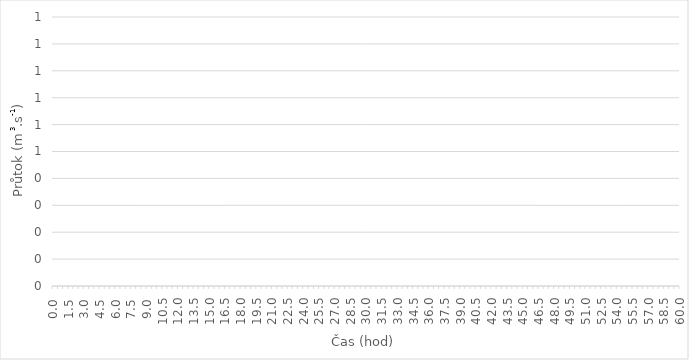
| Category | - |
|---|---|
| 0.0 | 0 |
| 0.5 | 0 |
| 1.0 | 0 |
| 1.5 | 0 |
| 2.0 | 0 |
| 2.5 | 0 |
| 3.0 | 0 |
| 3.5 | 0 |
| 4.0 | 0 |
| 4.5 | 0 |
| 5.0 | 0 |
| 5.5 | 0 |
| 6.0 | 0 |
| 6.5 | 0 |
| 7.0 | 0 |
| 7.5 | 0 |
| 8.0 | 0 |
| 8.5 | 0 |
| 9.0 | 0 |
| 9.5 | 0 |
| 10.0 | 0 |
| 10.5 | 0 |
| 11.0 | 0 |
| 11.5 | 0 |
| 12.0 | 0 |
| 12.5 | 0 |
| 13.0 | 0 |
| 13.5 | 0 |
| 14.0 | 0 |
| 14.5 | 0 |
| 15.0 | 0 |
| 15.5 | 0 |
| 16.0 | 0 |
| 16.5 | 0 |
| 17.0 | 0 |
| 17.5 | 0 |
| 18.0 | 0 |
| 18.5 | 0 |
| 19.0 | 0 |
| 19.5 | 0 |
| 20.0 | 0 |
| 20.5 | 0 |
| 21.0 | 0 |
| 21.5 | 0 |
| 22.0 | 0 |
| 22.5 | 0 |
| 23.0 | 0 |
| 23.5 | 0 |
| 24.0 | 0 |
| 24.5 | 0 |
| 25.0 | 0 |
| 25.5 | 0 |
| 26.0 | 0 |
| 26.5 | 0 |
| 27.0 | 0 |
| 27.5 | 0 |
| 28.0 | 0 |
| 28.5 | 0 |
| 29.0 | 0 |
| 29.5 | 0 |
| 30.0 | 0 |
| 30.5 | 0 |
| 31.0 | 0 |
| 31.5 | 0 |
| 32.0 | 0 |
| 32.5 | 0 |
| 33.0 | 0 |
| 33.5 | 0 |
| 34.0 | 0 |
| 34.5 | 0 |
| 35.0 | 0 |
| 35.5 | 0 |
| 36.0 | 0 |
| 36.5 | 0 |
| 37.0 | 0 |
| 37.5 | 0 |
| 38.0 | 0 |
| 38.5 | 0 |
| 39.0 | 0 |
| 39.5 | 0 |
| 40.0 | 0 |
| 40.5 | 0 |
| 41.0 | 0 |
| 41.5 | 0 |
| 42.0 | 0 |
| 42.5 | 0 |
| 43.0 | 0 |
| 43.5 | 0 |
| 44.0 | 0 |
| 44.5 | 0 |
| 45.0 | 0 |
| 45.5 | 0 |
| 46.0 | 0 |
| 46.5 | 0 |
| 47.0 | 0 |
| 47.5 | 0 |
| 48.0 | 0 |
| 48.5 | 0 |
| 49.0 | 0 |
| 49.5 | 0 |
| 50.0 | 0 |
| 50.5 | 0 |
| 51.0 | 0 |
| 51.5 | 0 |
| 52.0 | 0 |
| 52.5 | 0 |
| 53.0 | 0 |
| 53.5 | 0 |
| 54.0 | 0 |
| 54.5 | 0 |
| 55.0 | 0 |
| 55.5 | 0 |
| 56.0 | 0 |
| 56.5 | 0 |
| 57.0 | 0 |
| 57.5 | 0 |
| 58.0 | 0 |
| 58.5 | 0 |
| 59.0 | 0 |
| 59.5 | 0 |
| 60.0 | 0 |